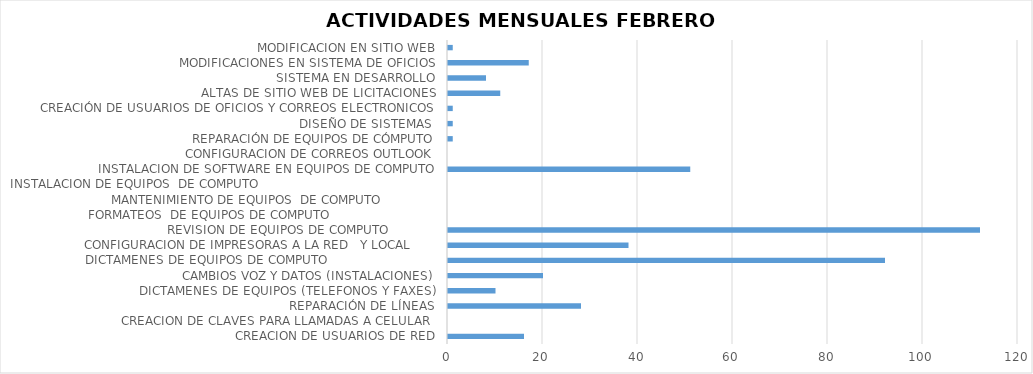
| Category | Series 0 |
|---|---|
| CREACION DE USUARIOS DE RED | 16 |
| CREACION DE CLAVES PARA LLAMADAS A CELULAR  | 0 |
| REPARACIÓN DE LÍNEAS | 28 |
| DICTAMENES DE EQUIPOS (TELEFONOS Y FAXES) | 10 |
| CAMBIOS VOZ Y DATOS (INSTALACIONES) | 20 |
| DICTAMENES DE EQUIPOS DE COMPUTO                             | 92 |
| CONFIGURACION DE IMPRESORAS A LA RED   Y LOCAL       | 38 |
| REVISION DE EQUIPOS DE COMPUTO             | 112 |
| FORMATEOS  DE EQUIPOS DE COMPUTO                            | 0 |
| MANTENIMIENTO DE EQUIPOS  DE COMPUTO               | 0 |
| INSTALACION DE EQUIPOS  DE COMPUTO                                               | 0 |
| INSTALACION DE SOFTWARE EN EQUIPOS DE COMPUTO | 51 |
| CONFIGURACION DE CORREOS OUTLOOK | 0 |
| REPARACIÓN DE EQUIPOS DE CÓMPUTO | 1 |
| DISEÑO DE SISTEMAS  | 1 |
| CREACIÓN DE USUARIOS DE OFICIOS Y CORREOS ELECTRONICOS | 1 |
| ALTAS DE SITIO WEB DE LICITACIONES | 11 |
| SISTEMA EN DESARROLLO | 8 |
| MODIFICACIONES EN SISTEMA DE OFICIOS | 17 |
| MODIFICACION EN SITIO WEB | 1 |